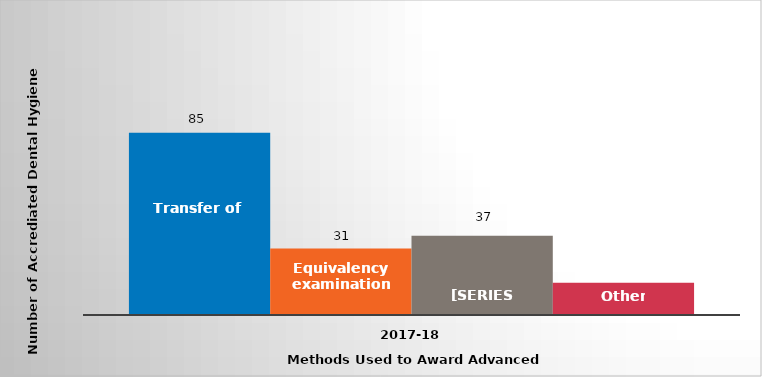
| Category | Transfer of credit | Equivalency examinations | Challenge examinations | Other |
|---|---|---|---|---|
| 2017-18 | 85 | 31 | 37 | 15 |